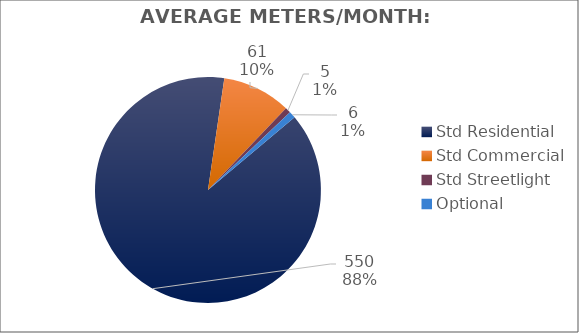
| Category | Meters |
|---|---|
| Std Residential | 550 |
| Std Commercial | 61 |
| Std Streetlight | 5 |
| Optional | 6 |